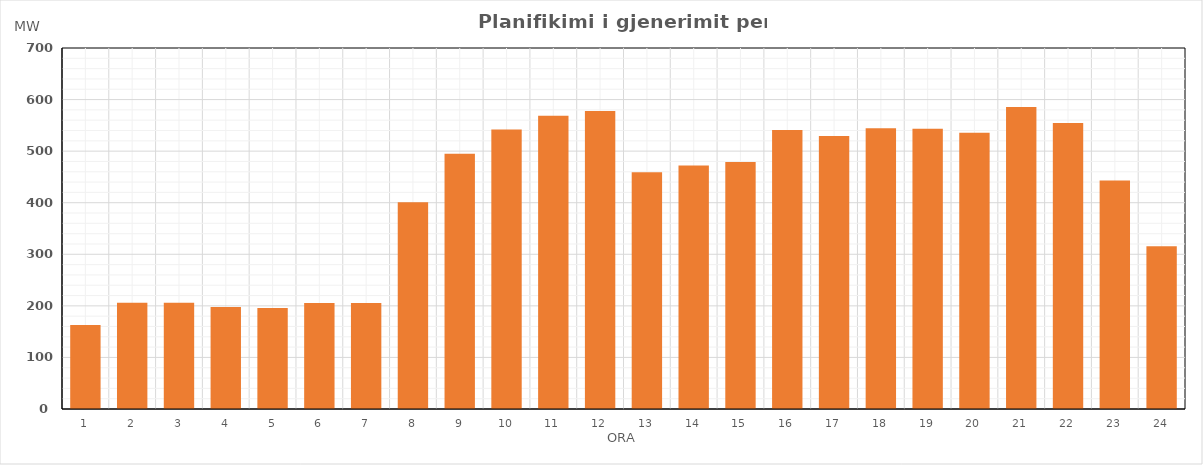
| Category | Max (MW) |
|---|---|
| 0 | 162.81 |
| 1 | 205.96 |
| 2 | 205.96 |
| 3 | 197.96 |
| 4 | 195.96 |
| 5 | 205.729 |
| 6 | 205.714 |
| 7 | 400.684 |
| 8 | 495.159 |
| 9 | 541.81 |
| 10 | 568.85 |
| 11 | 577.639 |
| 12 | 459.084 |
| 13 | 471.948 |
| 14 | 479.053 |
| 15 | 541.163 |
| 16 | 529.183 |
| 17 | 544.293 |
| 18 | 543.422 |
| 19 | 535.538 |
| 20 | 585.528 |
| 21 | 554.534 |
| 22 | 443.034 |
| 23 | 315.409 |